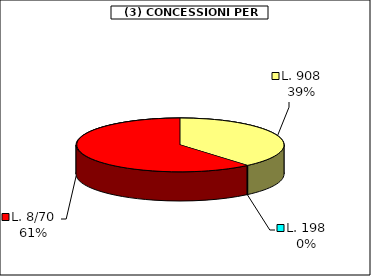
| Category | Series 0 |
|---|---|
| L. 908 | 68493.5 |
| L. 198 | 227 |
| L. 8/70 | 108085.85 |